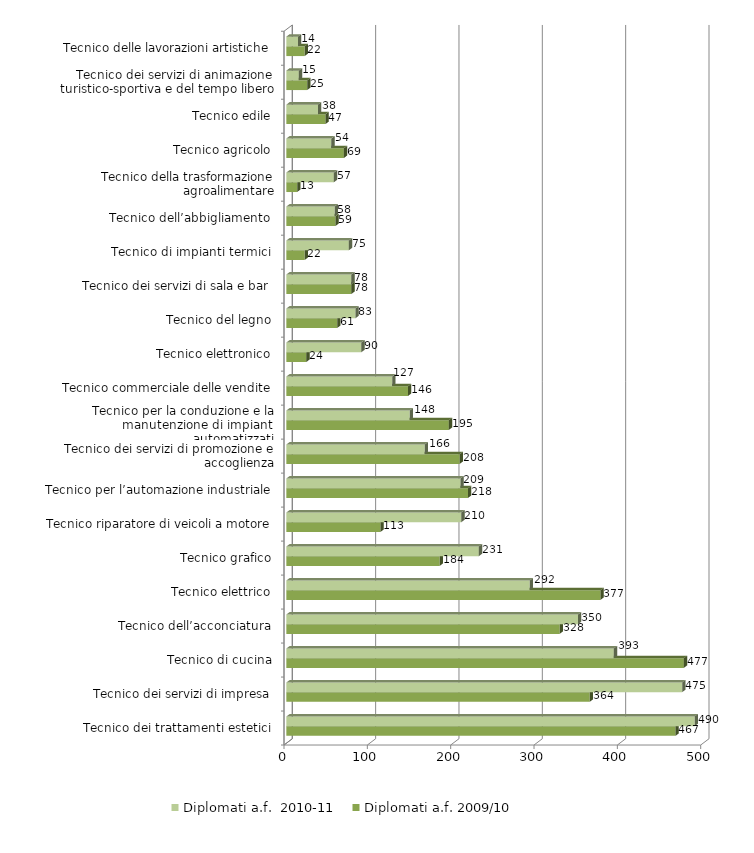
| Category | Diplomati a.f. 2009/10 | Diplomati a.f.  2010-11 |
|---|---|---|
| Tecnico dei trattamenti estetici | 467 | 490 |
| Tecnico dei servizi di impresa | 364 | 475 |
| Tecnico di cucina | 477 | 393 |
| Tecnico dell’acconciatura | 328 | 350 |
| Tecnico elettrico | 377 | 292 |
| Tecnico grafico | 184 | 231 |
| Tecnico riparatore di veicoli a motore | 113 | 210 |
| Tecnico per l’automazione industriale | 218 | 209 |
| Tecnico dei servizi di promozione e accoglienza | 208 | 166 |
| Tecnico per la conduzione e la manutenzione di impianti automatizzati | 195 | 148 |
| Tecnico commerciale delle vendite | 146 | 127 |
| Tecnico elettronico | 24 | 90 |
| Tecnico del legno | 61 | 83 |
| Tecnico dei servizi di sala e bar | 78 | 78 |
| Tecnico di impianti termici | 22 | 75 |
| Tecnico dell’abbigliamento | 59 | 58 |
| Tecnico della trasformazione agroalimentare | 13 | 57 |
| Tecnico agricolo | 69 | 54 |
| Tecnico edile | 47 | 38 |
| Tecnico dei servizi di animazione turistico-sportiva e del tempo libero | 25 | 15 |
| Tecnico delle lavorazioni artistiche | 22 | 14 |